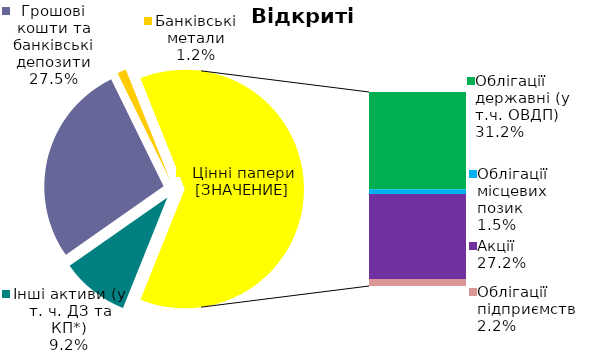
| Category | Series 0 |
|---|---|
| Інші активи (у т. ч. ДЗ та КП*) | 0.092 |
| Грошові кошти та банківські депозити | 0.275 |
| Банківські метали | 0.012 |
| Облігації державні (у т.ч. ОВДП) | 0.312 |
| Облігації місцевих позик | 0.015 |
| Акцiї | 0.272 |
| Облігації підприємств | 0.022 |